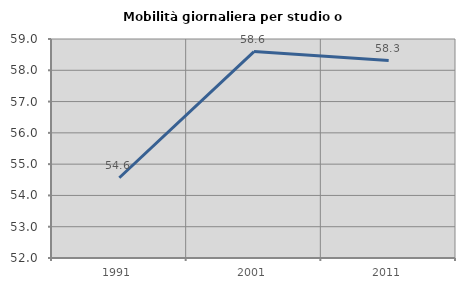
| Category | Mobilità giornaliera per studio o lavoro |
|---|---|
| 1991.0 | 54.566 |
| 2001.0 | 58.597 |
| 2011.0 | 58.31 |